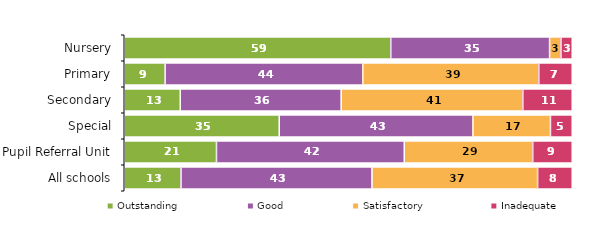
| Category | Outstanding | Good | Satisfactory | Inadequate |
|---|---|---|---|---|
| Nursery | 59.494 | 35.443 | 2.532 | 2.532 |
| Primary | 9.115 | 44.144 | 39.273 | 7.469 |
| Secondary | 12.5 | 35.923 | 40.541 | 11.036 |
| Special | 34.595 | 43.243 | 17.297 | 4.865 |
| Pupil Referral Unit | 20.588 | 41.912 | 28.676 | 8.824 |
| All schools | 12.672 | 42.635 | 36.963 | 7.73 |